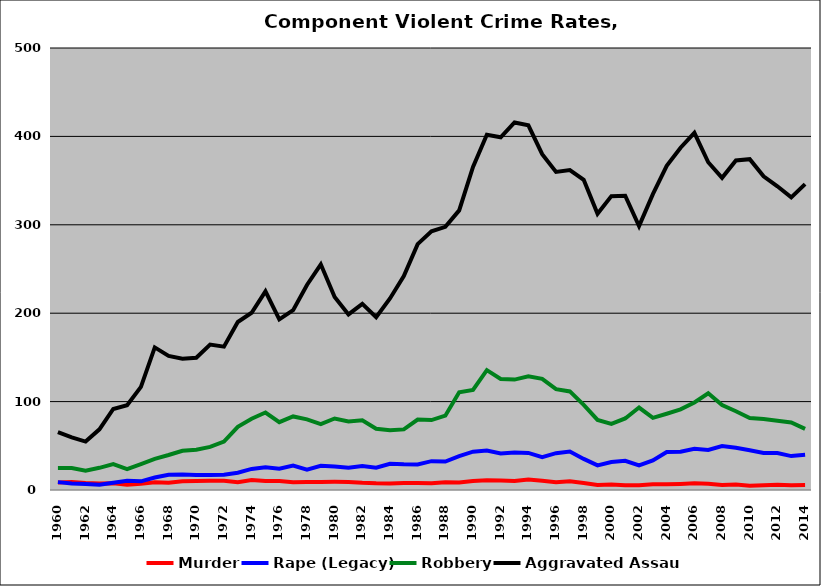
| Category | Murder | Rape (Legacy) | Robbery | Aggravated Assault |
|---|---|---|---|---|
| 1960.0 | 8.509 | 8.901 | 24.8 | 65.5 |
| 1961.0 | 9.071 | 7.234 | 24.819 | 59.544 |
| 1962.0 | 7.899 | 6.802 | 21.942 | 54.8 |
| 1963.0 | 7.374 | 6.082 | 25.081 | 68.622 |
| 1964.0 | 7.605 | 8.122 | 29.229 | 91.671 |
| 1965.0 | 5.867 | 10.357 | 23.724 | 95.867 |
| 1966.0 | 7.11 | 9.821 | 29.361 | 116.624 |
| 1967.0 | 8.791 | 14.177 | 35.213 | 161.331 |
| 1968.0 | 8.101 | 17.346 | 39.563 | 151.69 |
| 1969.0 | 9.875 | 17.393 | 44.361 | 148.421 |
| 1970.0 | 10.139 | 17.054 | 45.599 | 149.535 |
| 1971.0 | 10.494 | 17.078 | 48.714 | 164.455 |
| 1972.0 | 10.415 | 17.29 | 54.803 | 162.184 |
| 1973.0 | 8.837 | 19.539 | 71.478 | 190.034 |
| 1974.0 | 11.203 | 23.86 | 80.698 | 200.485 |
| 1975.0 | 10.066 | 25.851 | 87.618 | 224.716 |
| 1976.0 | 10.1 | 24.182 | 76.719 | 192.935 |
| 1977.0 | 8.769 | 27.612 | 83.209 | 203.358 |
| 1978.0 | 9.103 | 23.102 | 79.963 | 231.93 |
| 1979.0 | 9.083 | 27.294 | 74.587 | 255.275 |
| 1980.0 | 9.194 | 26.663 | 80.909 | 218.429 |
| 1981.0 | 9.111 | 25.153 | 77.419 | 198.649 |
| 1982.0 | 8.162 | 27.15 | 78.787 | 210.563 |
| 1983.0 | 7.646 | 25.172 | 69.33 | 195.533 |
| 1984.0 | 7.493 | 29.672 | 67.561 | 216.645 |
| 1985.0 | 7.927 | 29.08 | 68.546 | 242.009 |
| 1986.0 | 8.052 | 28.921 | 79.68 | 278.162 |
| 1987.0 | 7.621 | 32.621 | 79.146 | 292.63 |
| 1988.0 | 8.712 | 32.205 | 84.104 | 297.647 |
| 1989.0 | 8.437 | 38.404 | 110.557 | 316.293 |
| 1990.0 | 10.252 | 43.348 | 113.199 | 365.419 |
| 1991.0 | 11.13 | 44.604 | 135.624 | 401.897 |
| 1992.0 | 10.796 | 41.267 | 125.511 | 398.958 |
| 1993.0 | 10.19 | 42.409 | 124.876 | 415.8 |
| 1994.0 | 11.985 | 41.908 | 128.74 | 412.475 |
| 1995.0 | 10.427 | 37.238 | 125.684 | 379.831 |
| 1996.0 | 8.725 | 41.673 | 114.104 | 359.841 |
| 1997.0 | 9.909 | 43.52 | 111.534 | 361.91 |
| 1998.0 | 7.92 | 35.185 | 96.217 | 350.906 |
| 1999.0 | 5.605 | 27.828 | 79.33 | 312.42 |
| 2000.0 | 6.284 | 31.72 | 74.849 | 332.423 |
| 2001.0 | 5.492 | 33.102 | 80.937 | 332.839 |
| 2002.0 | 5.247 | 27.861 | 93.265 | 298.603 |
| 2003.0 | 6.599 | 33.397 | 81.642 | 334.742 |
| 2004.0 | 6.4 | 43.018 | 86.255 | 366.655 |
| 2005.0 | 6.809 | 43.304 | 91.22 | 387.18 |
| 2006.0 | 7.507 | 46.64 | 98.973 | 404.038 |
| 2007.0 | 7.09 | 45.33 | 109.391 | 370.75 |
| 2008.0 | 5.719 | 49.69 | 96.103 | 353.132 |
| 2009.0 | 6.195 | 47.691 | 89.152 | 372.805 |
| 2010.0 | 4.733 | 44.994 | 81.347 | 374.256 |
| 2011.0 | 5.445 | 41.857 | 80.209 | 354.797 |
| 2012.0 | 5.899 | 41.799 | 78.31 | 343.545 |
| 2013.0 | 5.34 | 38.361 | 76.417 | 331.084 |
| 2014.0 | 5.562 | 39.847 | 69.108 | 346.046 |